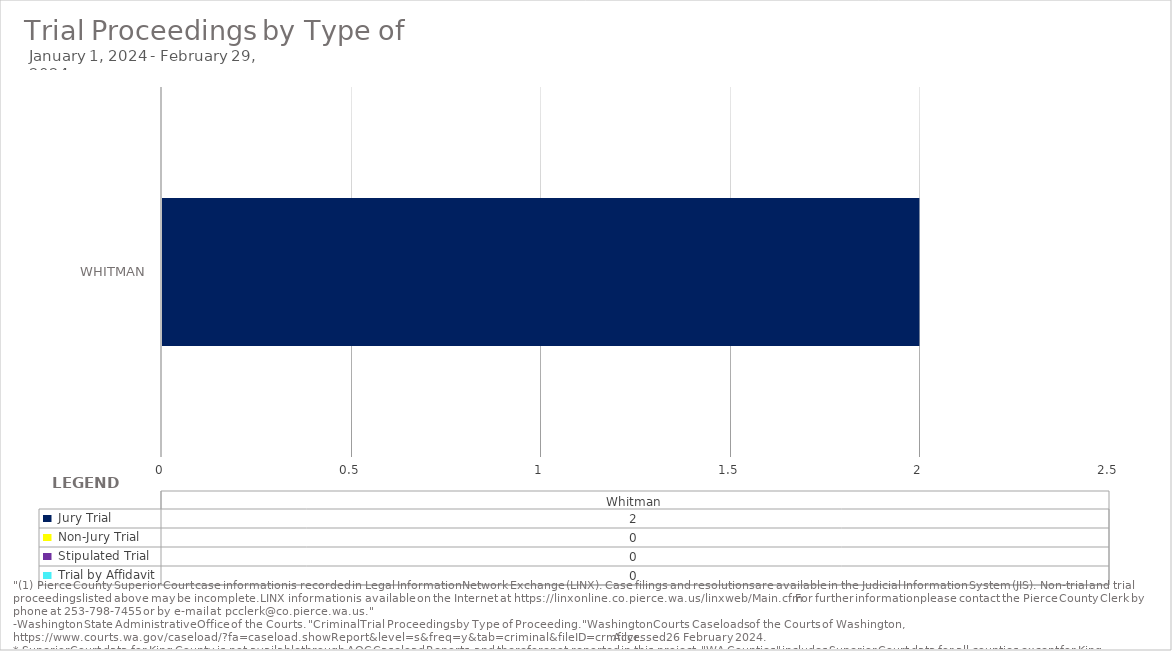
| Category |  Jury Trial  |  Non-Jury Trial  |  Stipulated Trial  |  Trial by Affidavit  |
|---|---|---|---|---|
| Whitman | 2 | 0 | 0 | 0 |